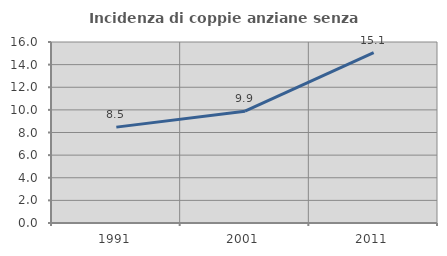
| Category | Incidenza di coppie anziane senza figli  |
|---|---|
| 1991.0 | 8.475 |
| 2001.0 | 9.884 |
| 2011.0 | 15.06 |